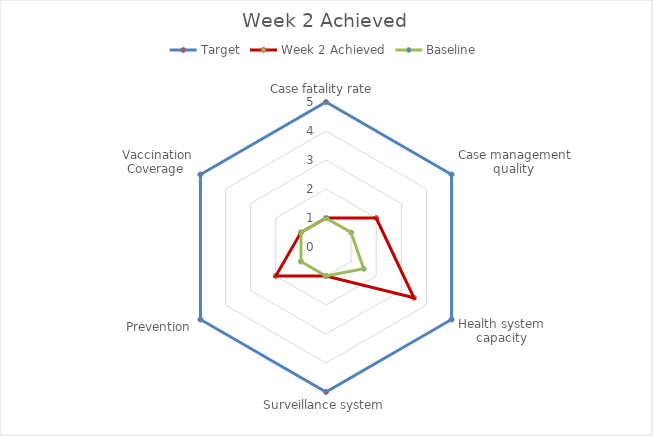
| Category | Target | Week 2 Achieved | Baseline |
|---|---|---|---|
| Case fatality rate  | 5 | 1 | 1 |
| Case management quality  | 5 | 2 | 1 |
| Health system capacity | 5 | 3.5 | 1.5 |
| Surveillance system | 5 | 1 | 1 |
| Prevention | 5 | 2 | 1 |
| Vaccination Coverage  | 5 | 1 | 1 |